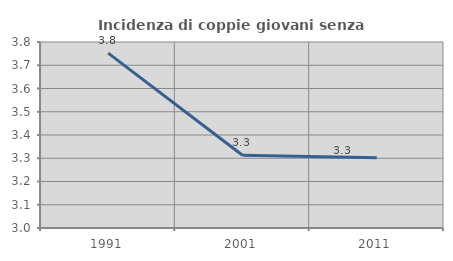
| Category | Incidenza di coppie giovani senza figli |
|---|---|
| 1991.0 | 3.752 |
| 2001.0 | 3.313 |
| 2011.0 | 3.302 |